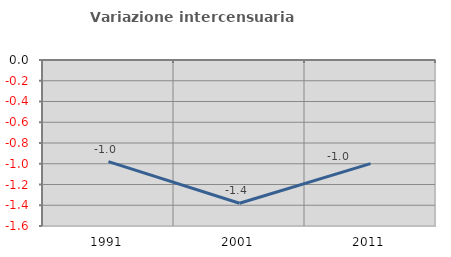
| Category | Variazione intercensuaria annua |
|---|---|
| 1991.0 | -0.979 |
| 2001.0 | -1.381 |
| 2011.0 | -0.999 |